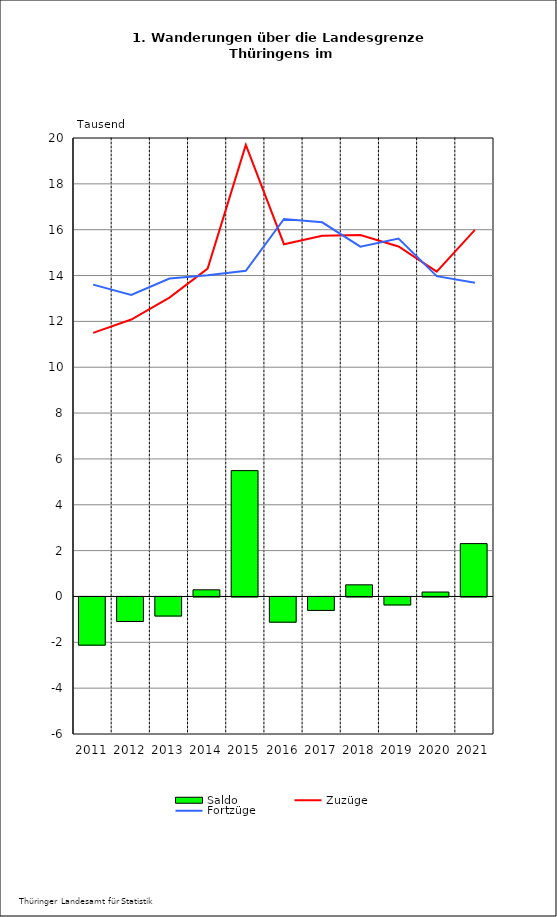
| Category | Saldo |
|---|---|
| 2011.0 | -2.102 |
| 2012.0 | -1.071 |
| 2013.0 | -0.832 |
| 2014.0 | 0.29 |
| 2015.0 | 5.49 |
| 2016.0 | -1.1 |
| 2017.0 | -0.587 |
| 2018.0 | 0.508 |
| 2019.0 | -0.349 |
| 2020.0 | 0.193 |
| 2021.0 | 2.305 |